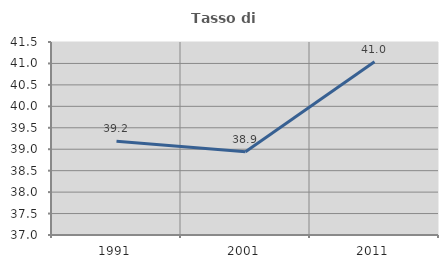
| Category | Tasso di occupazione   |
|---|---|
| 1991.0 | 39.185 |
| 2001.0 | 38.943 |
| 2011.0 | 41.042 |